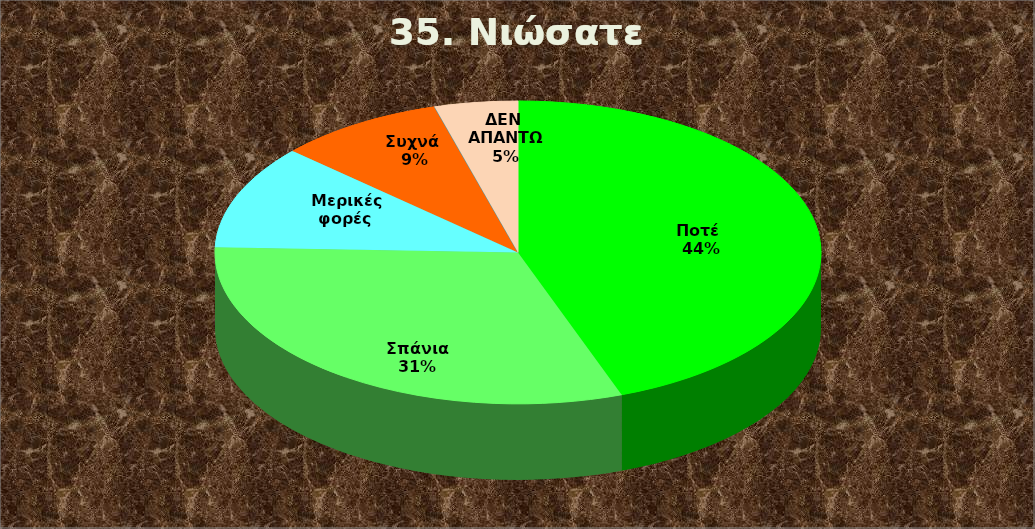
| Category | Series 0 |
|---|---|
| Ποτέ  | 20 |
| Σπάνια  | 14 |
| Μερικές φορές  | 5 |
| Συχνά  | 4 |
| Συνήθως  | 0 |
| ΔΕΝ ΑΠΑΝΤΩ | 2 |